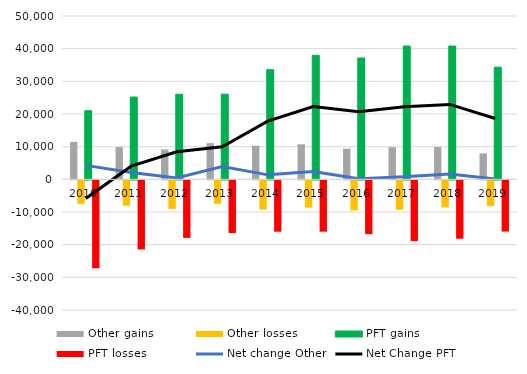
| Category | Other gains | Other losses | PFT gains | PFT losses |
|---|---|---|---|---|
| 2010.0 | 11466 | -7189 | 20999 | -26892 |
| 2011.0 | 9871 | -7772 | 25195 | -21166 |
| 2012.0 | 9151 | -8736 | 26043 | -17624 |
| 2013.0 | 11089 | -7190 | 26065 | -16124 |
| 2014.0 | 10317 | -8948 | 33565 | -15732 |
| 2015.0 | 10724 | -8346 | 37980 | -15716 |
| 2016.0 | 9385 | -9208 | 37145 | -16452 |
| 2017.0 | 9823 | -8999 | 40813 | -18613 |
| 2018.0 | 9905 | -8288 | 40800 | -17872 |
| 2019.0 | 7954 | -7826 | 34324 | -15691 |